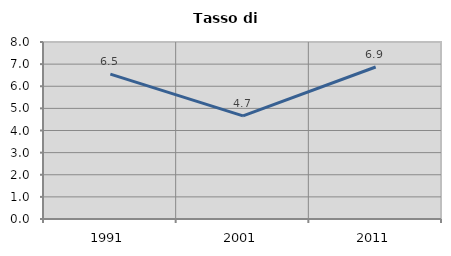
| Category | Tasso di disoccupazione   |
|---|---|
| 1991.0 | 6.546 |
| 2001.0 | 4.664 |
| 2011.0 | 6.871 |